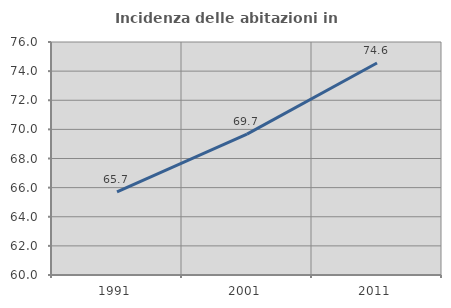
| Category | Incidenza delle abitazioni in proprietà  |
|---|---|
| 1991.0 | 65.712 |
| 2001.0 | 69.674 |
| 2011.0 | 74.554 |